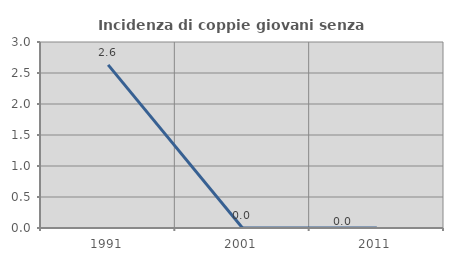
| Category | Incidenza di coppie giovani senza figli |
|---|---|
| 1991.0 | 2.632 |
| 2001.0 | 0 |
| 2011.0 | 0 |